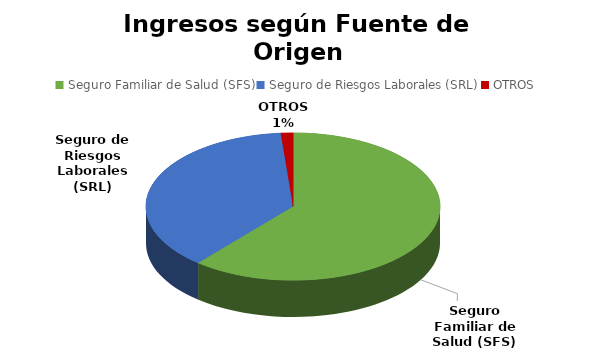
| Category | Series 0 |
|---|---|
| Seguro Familiar de Salud (SFS) | 352260344.05 |
| Seguro de Riesgos Laborales (SRL) | 216447869.27 |
| OTROS | 7663482.07 |